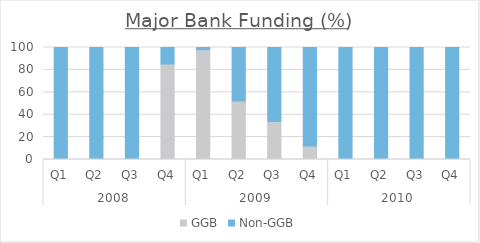
| Category | GGB | Non-GGB |
|---|---|---|
| 0 | 0 | 100 |
| 1 | 0 | 100 |
| 2 | 0 | 100 |
| 3 | 85.265 | 14.735 |
| 4 | 98.048 | 1.952 |
| 5 | 52.215 | 47.785 |
| 6 | 33.963 | 66.037 |
| 7 | 12.141 | 87.859 |
| 8 | 0 | 100 |
| 9 | 0 | 100 |
| 10 | 0 | 100 |
| 11 | 0 | 100 |